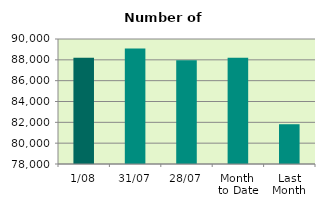
| Category | Series 0 |
|---|---|
| 1/08 | 88194 |
| 31/07 | 89086 |
| 28/07 | 87966 |
| Month 
to Date | 88194 |
| Last
Month | 81818 |